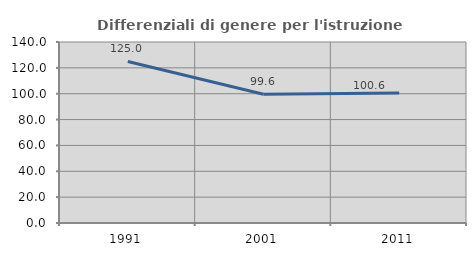
| Category | Differenziali di genere per l'istruzione superiore |
|---|---|
| 1991.0 | 124.979 |
| 2001.0 | 99.562 |
| 2011.0 | 100.597 |